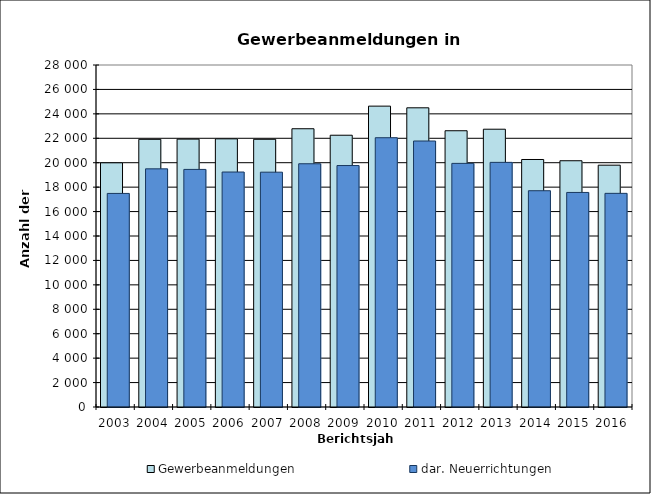
| Category | Gewerbeanmeldungen | dar. Neuerrichtungen |
|---|---|---|
| 2003.0 | 19992 | 17485 |
| 2004.0 | 21914 | 19499 |
| 2005.0 | 21931 | 19452 |
| 2006.0 | 21955 | 19238 |
| 2007.0 | 21918 | 19225 |
| 2008.0 | 22781 | 19914 |
| 2009.0 | 22250 | 19769 |
| 2010.0 | 24632 | 22046 |
| 2011.0 | 24495 | 21777 |
| 2012.0 | 22618 | 19945 |
| 2013.0 | 22743 | 20029 |
| 2014.0 | 20264 | 17706 |
| 2015.0 | 20162 | 17566 |
| 2016.0 | 19798 | 17492 |